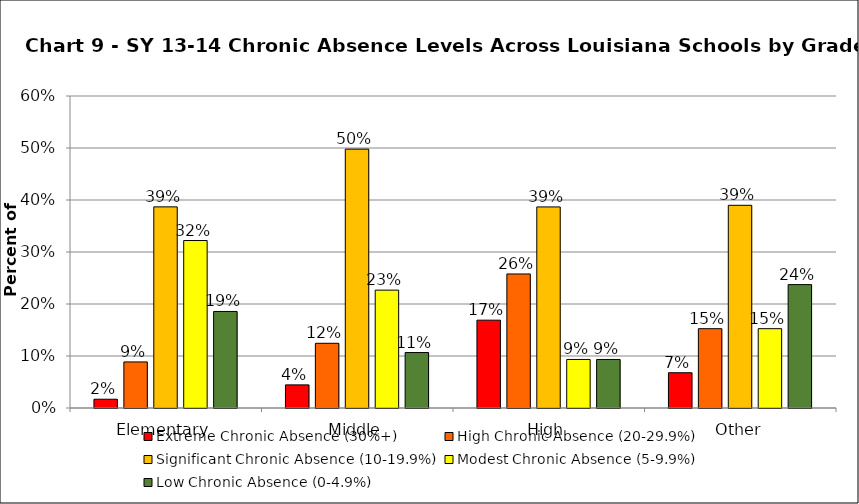
| Category | Extreme Chronic Absence (30%+) | High Chronic Absence (20-29.9%) | Significant Chronic Absence (10-19.9%) | Modest Chronic Absence (5-9.9%) | Low Chronic Absence (0-4.9%) |
|---|---|---|---|---|---|
| 0 | 0.017 | 0.089 | 0.387 | 0.322 | 0.186 |
| 1 | 0.044 | 0.124 | 0.498 | 0.227 | 0.107 |
| 2 | 0.169 | 0.258 | 0.387 | 0.093 | 0.093 |
| 3 | 0.068 | 0.153 | 0.39 | 0.153 | 0.237 |